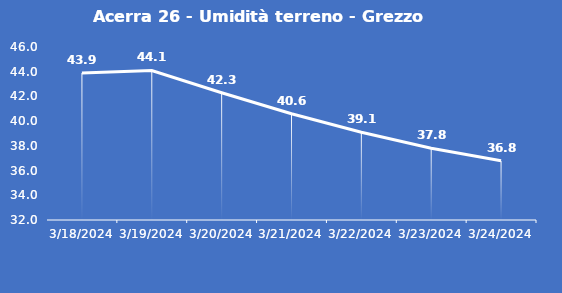
| Category | Acerra 26 - Umidità terreno - Grezzo (%VWC) |
|---|---|
| 3/18/24 | 43.9 |
| 3/19/24 | 44.1 |
| 3/20/24 | 42.3 |
| 3/21/24 | 40.6 |
| 3/22/24 | 39.1 |
| 3/23/24 | 37.8 |
| 3/24/24 | 36.8 |